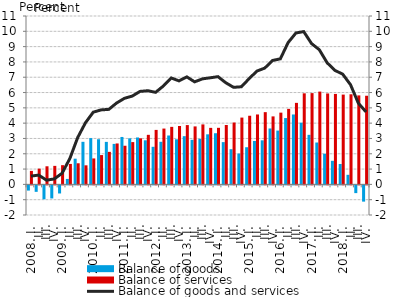
| Category | Balance of goods | Balance of services |
|---|---|---|
| 2008. I. | -0.339 | 0.881 |
|          II. | -0.422 | 1.028 |
|          III. | -0.907 | 1.183 |
|          IV. | -0.854 | 1.21 |
| 2009. I. | -0.529 | 1.256 |
|          II. | 0.357 | 1.337 |
|          III. | 1.679 | 1.379 |
|          IV. | 2.781 | 1.245 |
| 2010. I. | 3.022 | 1.695 |
|          II. | 2.95 | 1.915 |
|          III. | 2.777 | 2.125 |
|          IV. | 2.645 | 2.674 |
| 2011. I. | 3.099 | 2.524 |
|          II. | 3.007 | 2.762 |
|          III. | 3.065 | 3.009 |
|          IV. | 2.881 | 3.237 |
| 2012. I. | 2.455 | 3.559 |
|          II. | 2.783 | 3.647 |
|          III. | 3.194 | 3.757 |
|          IV. | 2.946 | 3.815 |
| 2013. I. | 3.15 | 3.874 |
| II. | 2.912 | 3.787 |
|          III. | 2.974 | 3.919 |
| IV. | 3.271 | 3.692 |
| 2014. I. | 3.342 | 3.695 |
| II. | 2.761 | 3.879 |
|          III. | 2.298 | 4.042 |
| IV. | 2.013 | 4.364 |
| 2015. I. | 2.427 | 4.484 |
| II. | 2.836 | 4.568 |
|          III. | 2.878 | 4.719 |
| IV. | 3.653 | 4.442 |
| 2016. I. | 3.515 | 4.687 |
| II. | 4.333 | 4.933 |
|          III. | 4.567 | 5.325 |
| IV. | 4.032 | 5.949 |
| 2017. I. | 3.237 | 5.963 |
| II. | 2.736 | 6.062 |
|          III. | 2.003 | 5.94 |
| IV. | 1.539 | 5.909 |
| 2018. I. | 1.333 | 5.866 |
| II. | 0.626 | 5.887 |
|          III. | -0.505 | 5.813 |
| IV. | -1.061 | 5.79 |